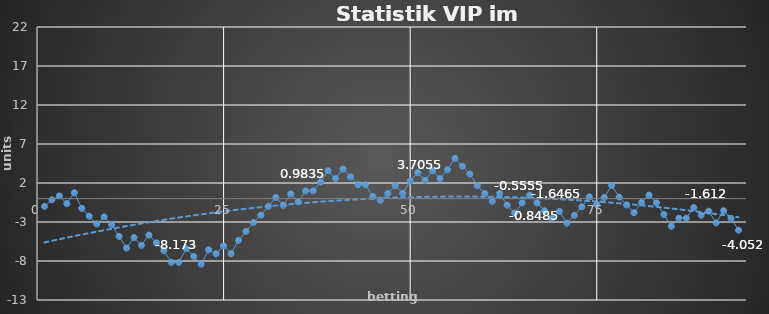
| Category | Series 0 |
|---|---|
| 0 | -1 |
| 1 | -0.153 |
| 2 | 0.347 |
| 3 | -0.653 |
| 4 | 0.748 |
| 5 | -1.252 |
| 6 | -2.252 |
| 7 | -3.252 |
| 8 | -2.343 |
| 9 | -3.343 |
| 10 | -4.843 |
| 11 | -6.343 |
| 12 | -4.993 |
| 13 | -5.993 |
| 14 | -4.673 |
| 15 | -5.673 |
| 16 | -6.673 |
| 17 | -8.173 |
| 18 | -8.173 |
| 19 | -6.414 |
| 20 | -7.414 |
| 21 | -8.414 |
| 22 | -6.57 |
| 23 | -7.07 |
| 24 | -6.07 |
| 25 | -7.07 |
| 26 | -5.36 |
| 27 | -4.2 |
| 28 | -3.08 |
| 29 | -2.118 |
| 30 | -0.998 |
| 31 | 0.142 |
| 32 | -0.858 |
| 33 | 0.604 |
| 34 | -0.396 |
| 35 | 0.984 |
| 36 | 0.984 |
| 37 | 2.124 |
| 38 | 3.579 |
| 39 | 2.579 |
| 40 | 3.779 |
| 41 | 2.779 |
| 42 | 1.779 |
| 43 | 1.779 |
| 44 | 0.279 |
| 45 | -0.221 |
| 46 | 0.656 |
| 47 | 1.666 |
| 48 | 0.666 |
| 49 | 2.226 |
| 50 | 3.326 |
| 51 | 2.326 |
| 52 | 3.566 |
| 53 | 2.566 |
| 54 | 3.706 |
| 55 | 5.152 |
| 56 | 4.152 |
| 57 | 3.152 |
| 58 | 1.652 |
| 59 | 0.652 |
| 60 | -0.348 |
| 61 | 0.652 |
| 62 | -0.848 |
| 63 | -1.848 |
| 64 | -0.555 |
| 65 | 0.445 |
| 66 | -0.555 |
| 67 | -1.555 |
| 68 | -2.555 |
| 69 | -1.646 |
| 70 | -3.146 |
| 71 | -2.138 |
| 72 | -1.051 |
| 73 | 0.223 |
| 74 | -0.777 |
| 75 | 0.132 |
| 76 | 1.692 |
| 77 | 0.192 |
| 78 | -0.808 |
| 79 | -1.808 |
| 80 | -0.488 |
| 81 | 0.455 |
| 82 | -0.545 |
| 83 | -2.045 |
| 84 | -3.545 |
| 85 | -2.505 |
| 86 | -2.505 |
| 87 | -1.142 |
| 88 | -2.142 |
| 89 | -1.612 |
| 90 | -3.112 |
| 91 | -1.552 |
| 92 | -2.552 |
| 93 | -4.052 |